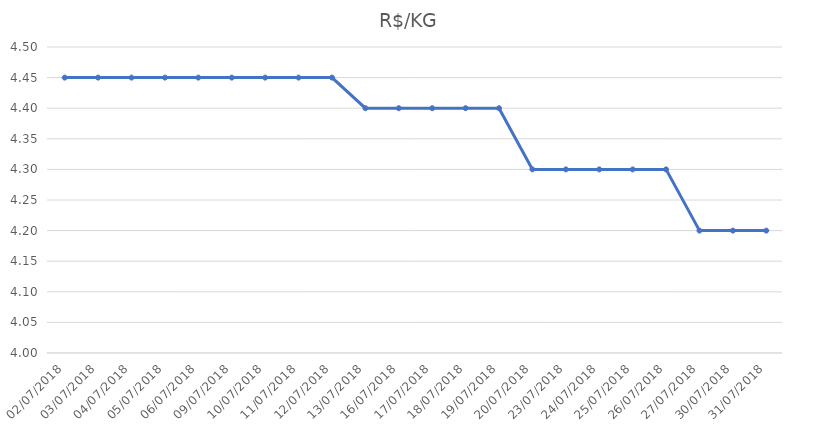
| Category | R$/KG |
|---|---|
| 02/07/2018 | 4.45 |
| 03/07/2018 | 4.45 |
| 04/07/2018 | 4.45 |
| 05/07/2018 | 4.45 |
| 06/07/2018 | 4.45 |
| 09/07/2018 | 4.45 |
| 10/07/2018 | 4.45 |
| 11/07/2018 | 4.45 |
| 12/07/2018 | 4.45 |
| 13/07/2018 | 4.4 |
| 16/07/2018 | 4.4 |
| 17/07/2018 | 4.4 |
| 18/07/2018 | 4.4 |
| 19/07/2018 | 4.4 |
| 20/07/2018 | 4.3 |
| 23/07/2018 | 4.3 |
| 24/07/2018 | 4.3 |
| 25/07/2018 | 4.3 |
| 26/07/2018 | 4.3 |
| 27/07/2018 | 4.2 |
| 30/07/2018 | 4.2 |
| 31/07/2018 | 4.2 |